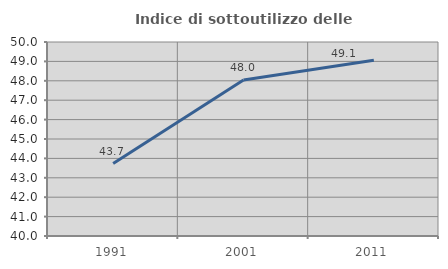
| Category | Indice di sottoutilizzo delle abitazioni  |
|---|---|
| 1991.0 | 43.737 |
| 2001.0 | 48.041 |
| 2011.0 | 49.065 |